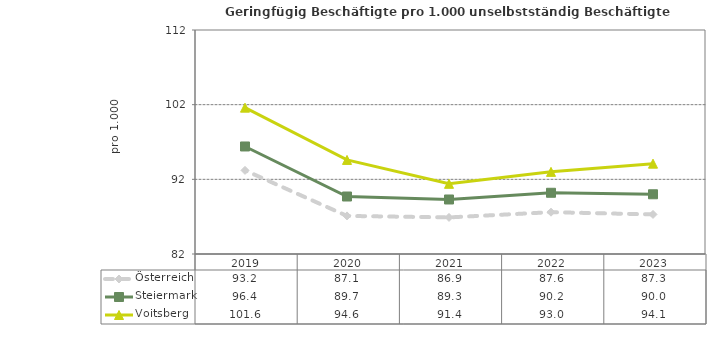
| Category | Österreich | Steiermark | Voitsberg |
|---|---|---|---|
| 2023.0 | 87.3 | 90 | 94.1 |
| 2022.0 | 87.6 | 90.2 | 93 |
| 2021.0 | 86.9 | 89.3 | 91.4 |
| 2020.0 | 87.1 | 89.7 | 94.6 |
| 2019.0 | 93.2 | 96.4 | 101.6 |